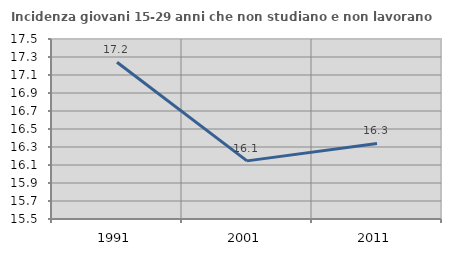
| Category | Incidenza giovani 15-29 anni che non studiano e non lavorano  |
|---|---|
| 1991.0 | 17.241 |
| 2001.0 | 16.146 |
| 2011.0 | 16.34 |